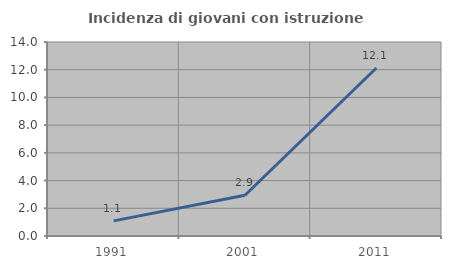
| Category | Incidenza di giovani con istruzione universitaria |
|---|---|
| 1991.0 | 1.093 |
| 2001.0 | 2.941 |
| 2011.0 | 12.121 |